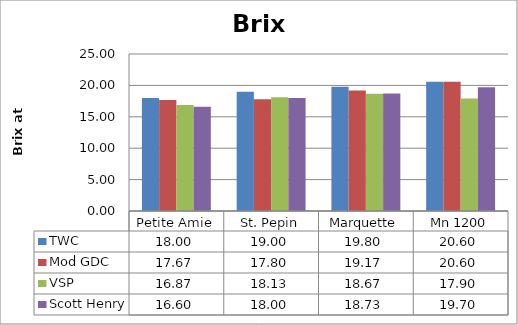
| Category | TWC | Mod GDC | VSP | Scott Henry |
|---|---|---|---|---|
| 0 | 18 | 17.67 | 16.87 | 16.6 |
| 1 | 19 | 17.8 | 18.13 | 18 |
| 2 | 19.8 | 19.17 | 18.67 | 18.73 |
| 3 | 20.6 | 20.6 | 17.9 | 19.7 |